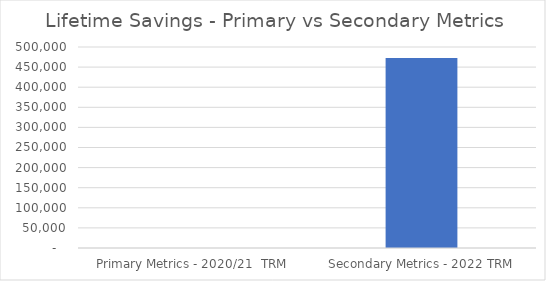
| Category | Series 0 |
|---|---|
| Primary Metrics - 2020/21  TRM | 0 |
| Secondary Metrics - 2022 TRM | 472527.043 |